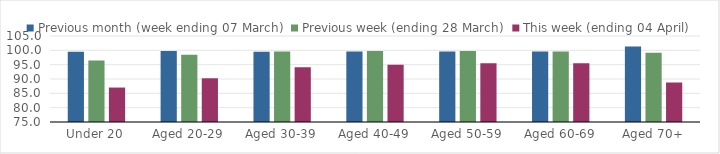
| Category | Previous month (week ending 07 March) | Previous week (ending 28 March) | This week (ending 04 April) |
|---|---|---|---|
| Under 20 | 99.472 | 96.459 | 87.018 |
| Aged 20-29 | 99.775 | 98.451 | 90.254 |
| Aged 30-39 | 99.474 | 99.588 | 94.106 |
| Aged 40-49 | 99.568 | 99.77 | 94.962 |
| Aged 50-59 | 99.619 | 99.791 | 95.479 |
| Aged 60-69 | 99.562 | 99.609 | 95.474 |
| Aged 70+ | 101.375 | 99.137 | 88.776 |